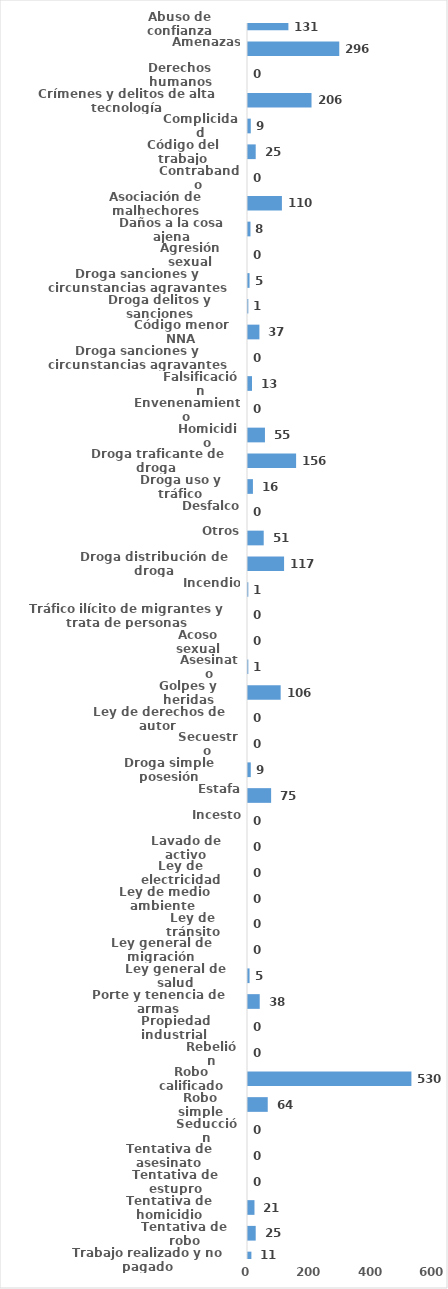
| Category | Series 0 |
|---|---|
| Abuso de confianza | 131 |
| Amenazas | 296 |
| Derechos humanos | 0 |
| Crímenes y delitos de alta tecnología | 206 |
| Complicidad | 9 |
| Código del trabajo | 25 |
| Contrabando | 0 |
| Asociación de malhechores | 110 |
| Daños a la cosa ajena | 8 |
| Agresión sexual | 0 |
| Droga sanciones y circunstancias agravantes | 5 |
| Droga delitos y sanciones | 1 |
| Código menor NNA | 37 |
| Droga sanciones y circunstancias agravantes | 0 |
| Falsificación | 13 |
| Envenenamiento | 0 |
| Homicidio | 55 |
| Droga traficante de droga  | 156 |
| Droga uso y tráfico | 16 |
| Desfalco | 0 |
| Otros | 51 |
| Droga distribución de droga | 117 |
| Incendio | 1 |
| Tráfico ilícito de migrantes y trata de personas | 0 |
| Acoso sexual | 0 |
| Asesinato | 1 |
| Golpes y heridas | 106 |
| Ley de derechos de autor  | 0 |
| Secuestro | 0 |
| Droga simple posesión | 9 |
| Estafa | 75 |
| Incesto | 0 |
| Lavado de activo | 0 |
| Ley de electricidad | 0 |
| Ley de medio ambiente  | 0 |
| Ley de tránsito | 0 |
| Ley general de migración | 0 |
| Ley general de salud | 5 |
| Porte y tenencia de armas | 38 |
| Propiedad industrial  | 0 |
| Rebelión | 0 |
| Robo calificado | 530 |
| Robo simple | 64 |
| Seducción | 0 |
| Tentativa de asesinato | 0 |
| Tentativa de estupro | 0 |
| Tentativa de homicidio | 21 |
| Tentativa de robo | 25 |
| Trabajo realizado y no pagado | 11 |